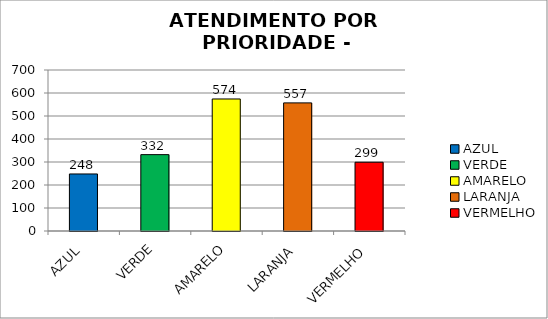
| Category | Total Regional: |
|---|---|
| AZUL | 248 |
| VERDE | 332 |
| AMARELO | 574 |
| LARANJA | 557 |
| VERMELHO | 299 |